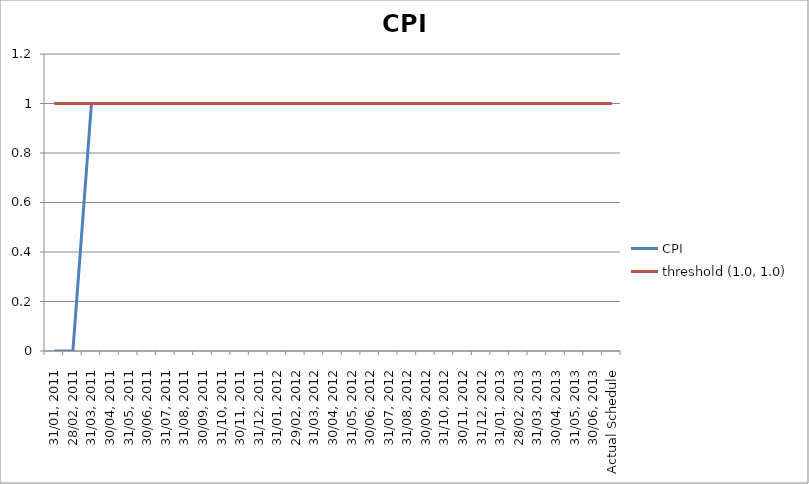
| Category | CPI | threshold (1.0, 1.0) |
|---|---|---|
| 31/01, 2011 | 0 | 1 |
| 28/02, 2011 | 0 | 1 |
| 31/03, 2011 | 1 | 1 |
| 30/04, 2011 | 1 | 1 |
| 31/05, 2011 | 1 | 1 |
| 30/06, 2011 | 1 | 1 |
| 31/07, 2011 | 1 | 1 |
| 31/08, 2011 | 1 | 1 |
| 30/09, 2011 | 1 | 1 |
| 31/10, 2011 | 1 | 1 |
| 30/11, 2011 | 1 | 1 |
| 31/12, 2011 | 1 | 1 |
| 31/01, 2012 | 1 | 1 |
| 29/02, 2012 | 1 | 1 |
| 31/03, 2012 | 1 | 1 |
| 30/04, 2012 | 1 | 1 |
| 31/05, 2012 | 1 | 1 |
| 30/06, 2012 | 1 | 1 |
| 31/07, 2012 | 1 | 1 |
| 31/08, 2012 | 1 | 1 |
| 30/09, 2012 | 1 | 1 |
| 31/10, 2012 | 1 | 1 |
| 30/11, 2012 | 1 | 1 |
| 31/12, 2012 | 1 | 1 |
| 31/01, 2013 | 1 | 1 |
| 28/02, 2013 | 1 | 1 |
| 31/03, 2013 | 1 | 1 |
| 30/04, 2013 | 1 | 1 |
| 31/05, 2013 | 1 | 1 |
| 30/06, 2013 | 1 | 1 |
| Actual Schedule | 1 | 1 |